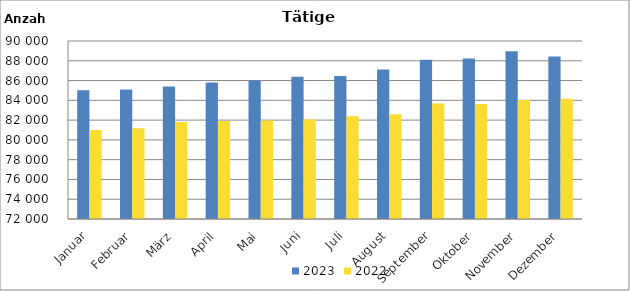
| Category | 2023 | 2022 |
|---|---|---|
| Januar | 85010 | 80993 |
| Februar | 85100 | 81174 |
| März | 85396 | 81820 |
| April | 85809 | 81900 |
| Mai | 85994 | 81969 |
| Juni | 86390 | 82069 |
| Juli | 86468 | 82398 |
| August | 87126 | 82590 |
| September | 88112 | 83673 |
| Oktober | 88227 | 83634 |
| November | 88958 | 84039 |
| Dezember | 88428 | 84165 |